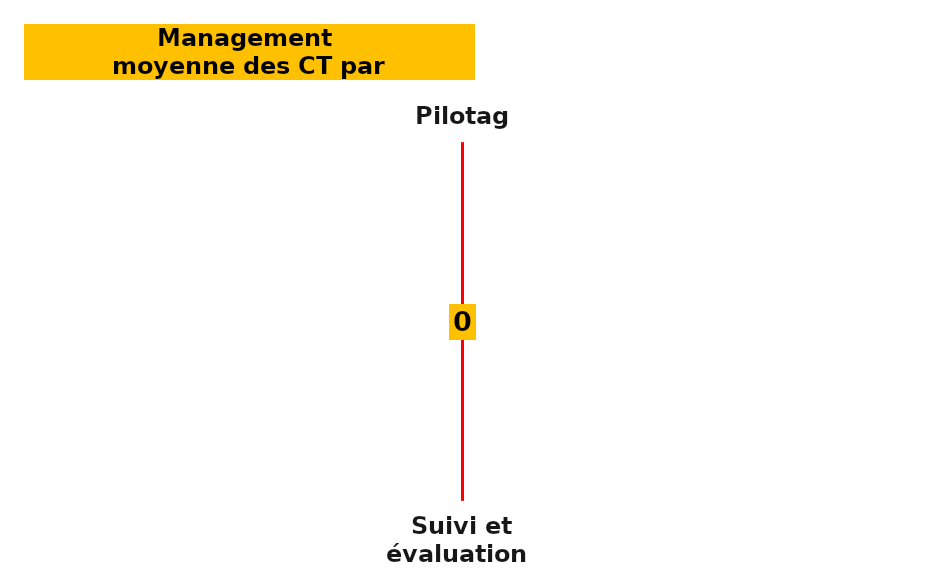
| Category | Series 0 | Series 1 | Series 2 | Series 3 |
|---|---|---|---|---|
| Pilotage | 0 | 6 | 13 | 25 |
| Suivi et évaluation   | 0 | 6 | 13 | 25 |